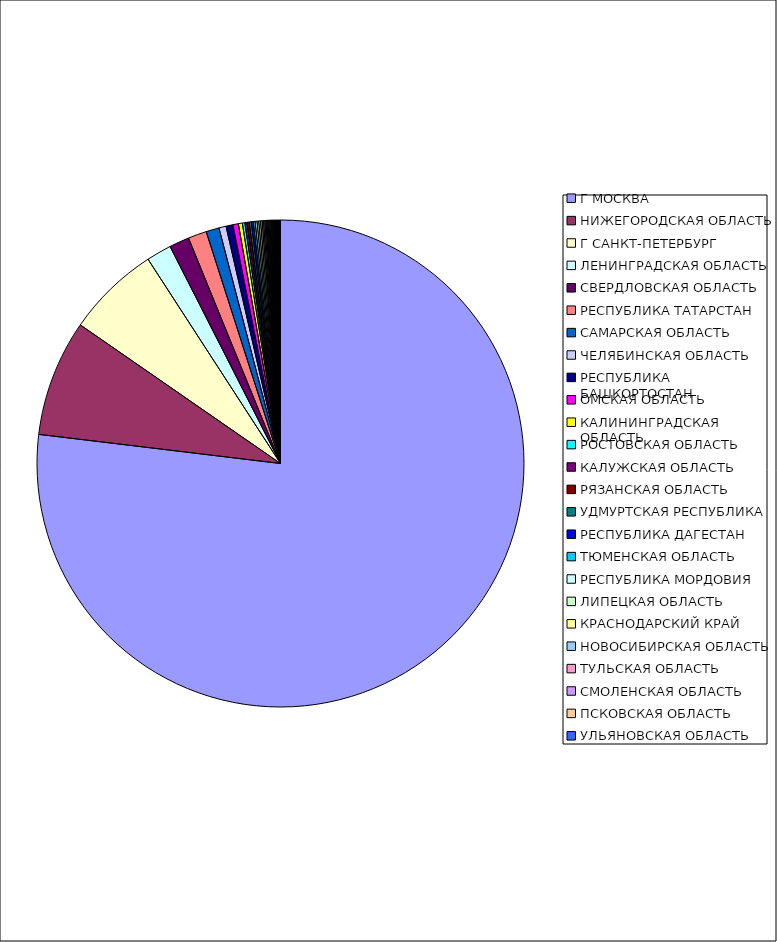
| Category | Оборот |
|---|---|
| Г МОСКВА | 0.768 |
| НИЖЕГОРОДСКАЯ ОБЛАСТЬ | 0.077 |
| Г САНКТ-ПЕТЕРБУРГ | 0.062 |
| ЛЕНИНГРАДСКАЯ ОБЛАСТЬ | 0.017 |
| СВЕРДЛОВСКАЯ ОБЛАСТЬ | 0.013 |
| РЕСПУБЛИКА ТАТАРСТАН | 0.012 |
| САМАРСКАЯ ОБЛАСТЬ | 0.009 |
| ЧЕЛЯБИНСКАЯ ОБЛАСТЬ | 0.005 |
| РЕСПУБЛИКА БАШКОРТОСТАН | 0.005 |
| ОМСКАЯ ОБЛАСТЬ | 0.004 |
| КАЛИНИНГРАДСКАЯ ОБЛАСТЬ | 0.003 |
| РОСТОВСКАЯ ОБЛАСТЬ | 0.002 |
| КАЛУЖСКАЯ ОБЛАСТЬ | 0.001 |
| РЯЗАНСКАЯ ОБЛАСТЬ | 0.001 |
| УДМУРТСКАЯ РЕСПУБЛИКА | 0.001 |
| РЕСПУБЛИКА ДАГЕСТАН | 0.001 |
| ТЮМЕНСКАЯ ОБЛАСТЬ | 0.001 |
| РЕСПУБЛИКА МОРДОВИЯ | 0.001 |
| ЛИПЕЦКАЯ ОБЛАСТЬ | 0.001 |
| КРАСНОДАРСКИЙ КРАЙ | 0.001 |
| НОВОСИБИРСКАЯ ОБЛАСТЬ | 0.001 |
| ТУЛЬСКАЯ ОБЛАСТЬ | 0.001 |
| СМОЛЕНСКАЯ ОБЛАСТЬ | 0.001 |
| ПСКОВСКАЯ ОБЛАСТЬ | 0.001 |
| УЛЬЯНОВСКАЯ ОБЛАСТЬ | 0.001 |
| ВОЛОГОДСКАЯ ОБЛАСТЬ | 0.001 |
| САРАТОВСКАЯ ОБЛАСТЬ | 0.001 |
| КОСТРОМСКАЯ ОБЛАСТЬ | 0.001 |
| КАБАРДИНО-БАЛКАРСКАЯ РЕСПУБЛИКА | 0.001 |
| ОРЕНБУРГСКАЯ ОБЛАСТЬ | 0.001 |
| СТАВРОПОЛЬСКИЙ КРАЙ | 0.001 |
| РЕСПУБЛИКА СЕВЕРНАЯ ОСЕТИЯ-АЛАНИЯ | 0.001 |
| ХАБАРОВСКИЙ КРАЙ | 0.001 |
| РЕСПУБЛИКА КОМИ | 0 |
| ИВАНОВСКАЯ ОБЛАСТЬ | 0 |
| ПРИМОРСКИЙ КРАЙ | 0 |
| АЛТАЙСКИЙ КРАЙ | 0 |
| ЧУВАШСКАЯ РЕСПУБЛИКА | 0 |
| КИРОВСКАЯ ОБЛАСТЬ | 0 |
| ИРКУТСКАЯ ОБЛАСТЬ | 0 |
| ОРЛОВСКАЯ ОБЛАСТЬ | 0 |
| МОСКОВСКАЯ ОБЛАСТЬ | 0 |
| РЕСПУБЛИКА БУРЯТИЯ | 0 |
| КРАСНОЯРСКИЙ КРАЙ | 0 |
| ПЕРМСКИЙ КРАЙ | 0 |
| САХАЛИНСКАЯ ОБЛАСТЬ | 0 |